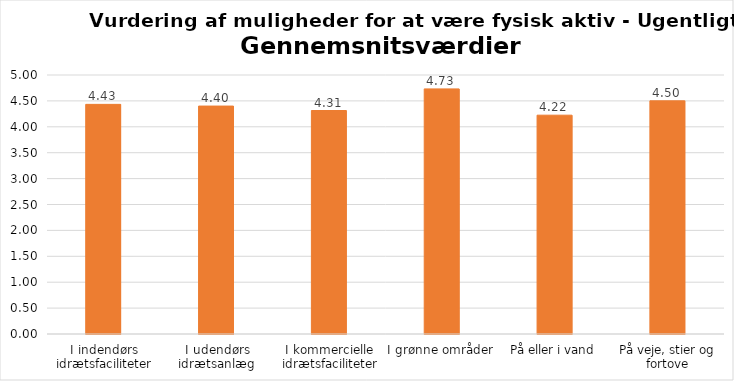
| Category | Gennemsnit |
|---|---|
| I indendørs idrætsfaciliteter | 4.433 |
| I udendørs idrætsanlæg | 4.4 |
| I kommercielle idrætsfaciliteter | 4.315 |
| I grønne områder | 4.732 |
| På eller i vand | 4.224 |
| På veje, stier og fortove | 4.501 |